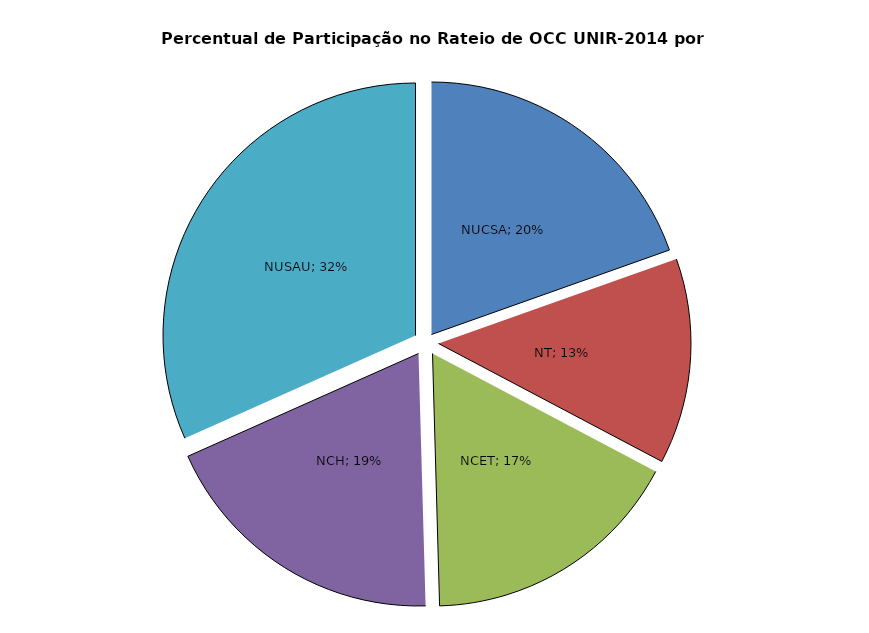
| Category | %PART |
|---|---|
| NUCSA | 0.193 |
| NT | 0.13 |
| NCET | 0.166 |
| NCH | 0.185 |
| NUSAU | 0.312 |